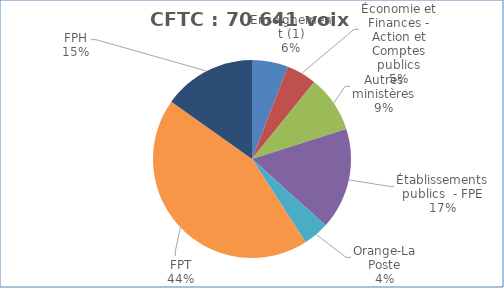
| Category | Nombre de voix |
|---|---|
| Enseignement (1) | 4171 |
| Économie et Finances - Action et Comptes publics | 3469.45 |
| Autres ministères | 6546 |
| Établissements publics  - FPE | 11721 |
| Orange-La Poste | 2990 |
| FPT | 31032 |
| FPH | 10712 |